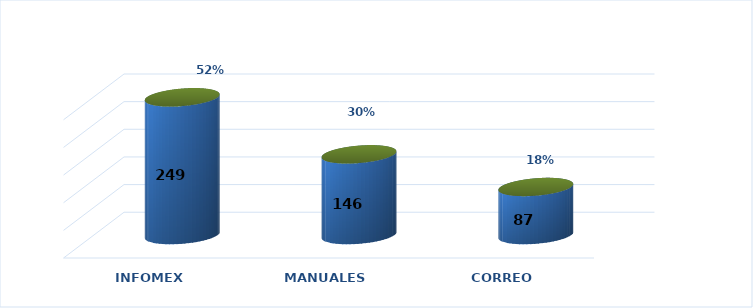
| Category | Series 0 | Series 1 |
|---|---|---|
| INFOMEX | 249 | 0.517 |
| MANUALES | 146 | 0.303 |
| CORREO | 87 | 0.18 |